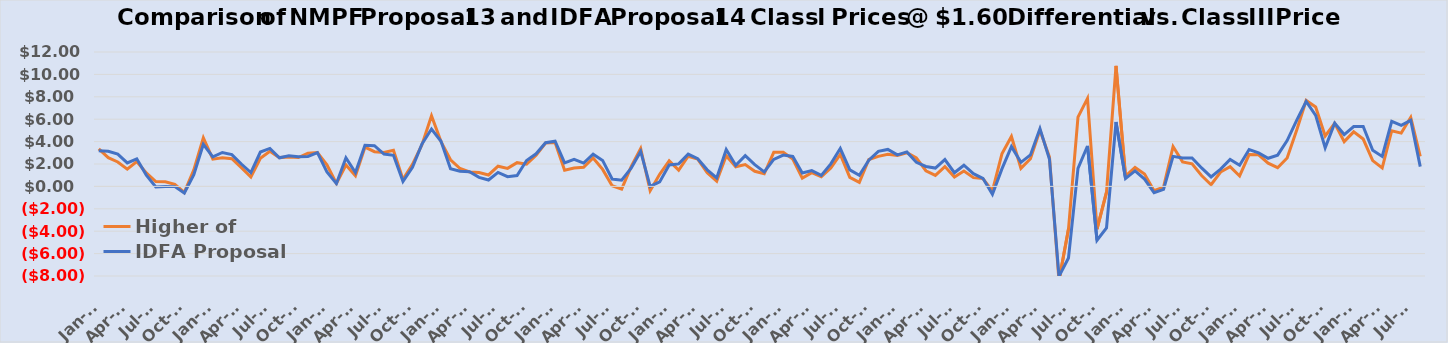
| Category | Higher of | IDFA Proposal  |
|---|---|---|
| 2012-01-01 | 3.35 | 3.18 |
| 2012-02-01 | 2.57 | 3.14 |
| 2012-03-01 | 2.18 | 2.88 |
| 2012-04-01 | 1.54 | 2.1 |
| 2012-05-01 | 2.22 | 2.46 |
| 2012-06-01 | 1.21 | 1.01 |
| 2012-07-01 | 0.43 | -0.05 |
| 2012-08-01 | 0.42 | -0.01 |
| 2012-09-01 | 0.19 | -0.02 |
| 2012-10-01 | -0.54 | -0.59 |
| 2012-11-01 | 1.47 | 1.05 |
| 2012-12-01 | 4.33 | 3.76 |
| 2013-01-01 | 2.43 | 2.63 |
| 2013-02-01 | 2.56 | 3.03 |
| 2013-03-01 | 2.47 | 2.84 |
| 2013-04-01 | 1.67 | 2 |
| 2013-05-01 | 0.84 | 1.24 |
| 2013-06-01 | 2.51 | 3.07 |
| 2013-07-01 | 3.13 | 3.39 |
| 2013-08-01 | 2.57 | 2.55 |
| 2013-09-01 | 2.62 | 2.73 |
| 2013-10-01 | 2.58 | 2.65 |
| 2013-11-01 | 2.97 | 2.67 |
| 2013-12-01 | 3.02 | 3.01 |
| 2014-01-01 | 1.93 | 1.29 |
| 2014-02-01 | 0.27 | 0.25 |
| 2014-03-01 | 1.91 | 2.55 |
| 2014-04-01 | 0.94 | 1.24 |
| 2014-05-01 | 3.5 | 3.68 |
| 2014-06-01 | 3.1 | 3.64 |
| 2014-07-01 | 3.02 | 2.89 |
| 2014-08-01 | 3.22 | 2.78 |
| 2014-09-01 | 0.63 | 0.45 |
| 2014-10-01 | 1.97 | 1.71 |
| 2014-11-01 | 3.72 | 3.79 |
| 2014-12-01 | 6.31 | 5.12 |
| 2015-01-01 | 4 | 4.03 |
| 2015-02-01 | 2.38 | 1.58 |
| 2015-03-01 | 1.6 | 1.36 |
| 2015-04-01 | 1.29 | 1.31 |
| 2015-05-01 | 1.24 | 0.81 |
| 2015-06-01 | 1.02 | 0.57 |
| 2015-07-01 | 1.8 | 1.25 |
| 2015-08-01 | 1.61 | 0.87 |
| 2015-09-01 | 2.12 | 0.97 |
| 2015-10-01 | 1.98 | 2.31 |
| 2015-11-01 | 2.78 | 2.91 |
| 2015-12-01 | 3.87 | 3.9 |
| 2016-01-01 | 3.92 | 4.03 |
| 2016-02-01 | 1.44 | 2.1 |
| 2016-03-01 | 1.64 | 2.42 |
| 2016-04-01 | 1.71 | 2.08 |
| 2016-05-01 | 2.54 | 2.87 |
| 2016-06-01 | 1.52 | 2.32 |
| 2016-07-01 | 0.06 | 0.66 |
| 2016-08-01 | -0.24 | 0.56 |
| 2016-09-01 | 1.77 | 1.63 |
| 2016-10-01 | 3.38 | 3.12 |
| 2016-11-01 | -0.38 | 0 |
| 2016-12-01 | 1.08 | 0.4 |
| 2017-01-01 | 2.28 | 1.91 |
| 2017-02-01 | 1.45 | 2.01 |
| 2017-03-01 | 2.69 | 2.88 |
| 2017-04-01 | 2.43 | 2.47 |
| 2017-05-01 | 1.23 | 1.48 |
| 2017-06-01 | 0.47 | 0.76 |
| 2017-07-01 | 2.74 | 3.29 |
| 2017-08-01 | 1.75 | 1.89 |
| 2017-09-01 | 1.95 | 2.74 |
| 2017-10-01 | 1.35 | 1.94 |
| 2017-11-01 | 1.13 | 1.3 |
| 2017-12-01 | 3.04 | 2.41 |
| 2018-01-01 | 3.04 | 2.8 |
| 2018-02-01 | 2.45 | 2.67 |
| 2018-03-01 | 0.74 | 1.2 |
| 2018-04-01 | 1.23 | 1.41 |
| 2018-05-01 | 0.86 | 0.98 |
| 2018-06-01 | 1.64 | 2.01 |
| 2018-07-01 | 2.86 | 3.38 |
| 2018-08-01 | 0.8 | 1.48 |
| 2018-09-01 | 0.36 | 0.99 |
| 2018-10-01 | 2.4 | 2.34 |
| 2018-11-01 | 2.68 | 3.13 |
| 2018-12-01 | 2.87 | 3.3 |
| 2019-01-01 | 2.76 | 2.82 |
| 2019-02-01 | 3.01 | 3.08 |
| 2019-03-01 | 2.54 | 2.15 |
| 2019-04-01 | 1.4 | 1.78 |
| 2019-05-01 | 0.98 | 1.64 |
| 2019-06-01 | 1.77 | 2.4 |
| 2019-07-01 | 0.84 | 1.22 |
| 2019-08-01 | 1.37 | 1.89 |
| 2019-09-01 | 0.78 | 1.14 |
| 2019-10-01 | 0.7 | 0.72 |
| 2019-11-01 | -0.41 | -0.71 |
| 2019-12-01 | 2.91 | 1.56 |
| 2020-01-01 | 4.46 | 3.55 |
| 2020-02-01 | 1.61 | 2.15 |
| 2020-03-01 | 2.47 | 2.81 |
| 2020-04-01 | 5.02 | 5.16 |
| 2020-05-01 | 2.61 | 2.41 |
| 2020-06-01 | -8.41 | -8.03 |
| 2020-07-01 | -3.81 | -6.39 |
| 2020-08-01 | 6.19 | 1.61 |
| 2020-09-01 | 7.86 | 3.61 |
| 2020-10-01 | -3.81 | -4.81 |
| 2020-11-01 | -0.52 | -3.7 |
| 2020-12-01 | 10.76 | 5.75 |
| 2021-01-01 | 0.91 | 0.7 |
| 2021-02-01 | 1.69 | 1.38 |
| 2021-03-01 | 1.11 | 0.65 |
| 2021-04-01 | -0.38 | -0.56 |
| 2021-05-01 | -0.07 | -0.26 |
| 2021-06-01 | 3.56 | 2.68 |
| 2021-07-01 | 2.19 | 2.53 |
| 2021-08-01 | 2.01 | 2.54 |
| 2021-09-01 | 0.97 | 1.65 |
| 2021-10-01 | 0.15 | 0.85 |
| 2021-11-01 | 1.28 | 1.55 |
| 2021-12-01 | 1.76 | 2.41 |
| 2022-01-01 | 0.93 | 1.89 |
| 2022-02-01 | 2.84 | 3.29 |
| 2022-03-01 | 2.82 | 2.99 |
| 2022-04-01 | 2.07 | 2.51 |
| 2022-05-01 | 1.67 | 2.79 |
| 2022-06-01 | 2.54 | 4.09 |
| 2022-07-01 | 5.02 | 5.9 |
| 2022-08-01 | 7.67 | 7.58 |
| 2022-09-01 | 7.09 | 6.35 |
| 2022-10-01 | 4.5 | 3.45 |
| 2022-11-01 | 5.63 | 5.64 |
| 2022-12-01 | 4 | 4.63 |
| 2023-01-01 | 4.87 | 5.34 |
| 2023-02-01 | 4.23 | 5.35 |
| 2023-03-01 | 2.3 | 3.23 |
| 2023-04-01 | 1.65 | 2.68 |
| 2023-05-01 | 4.97 | 5.81 |
| 2023-06-01 | 4.76 | 5.45 |
| 2023-07-01 | 6.17 | 5.9 |
| 2023-08-01 | 2.69 | 1.77 |